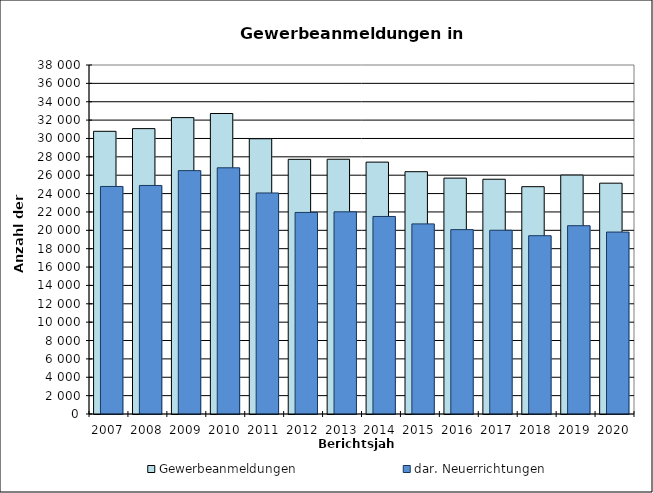
| Category | Gewerbeanmeldungen | dar. Neuerrichtungen |
|---|---|---|
| 2007.0 | 30781 | 24775 |
| 2008.0 | 31074 | 24884 |
| 2009.0 | 32271 | 26499 |
| 2010.0 | 32718 | 26806 |
| 2011.0 | 29971 | 24066 |
| 2012.0 | 27728 | 21948 |
| 2013.0 | 27739 | 22013 |
| 2014.0 | 27426 | 21509 |
| 2015.0 | 26383 | 20698 |
| 2016.0 | 25683 | 20075 |
| 2017.0 | 25561 | 20008 |
| 2018.0 | 24752 | 19413 |
| 2019.0 | 26015 | 20501 |
| 2020.0 | 25132 | 19811 |